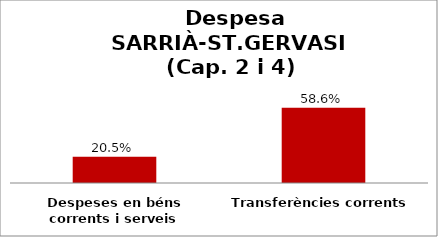
| Category | Series 0 |
|---|---|
| Despeses en béns corrents i serveis | 0.205 |
| Transferències corrents | 0.586 |